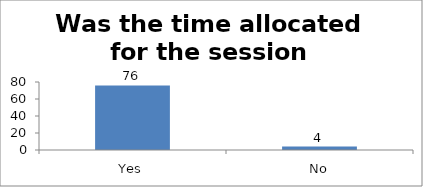
| Category | Was the time allocated for the session sufficient? |
|---|---|
| Yes | 76 |
| No | 4 |